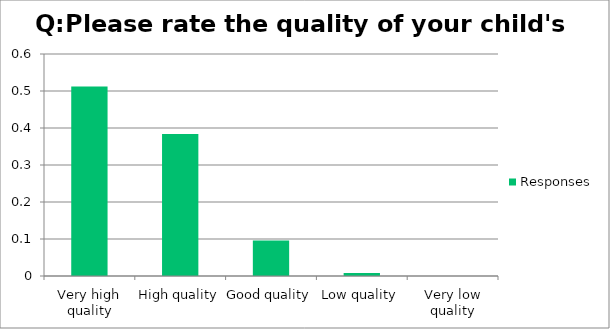
| Category | Responses |
|---|---|
| Very high quality | 0.512 |
| High quality | 0.384 |
| Good quality | 0.096 |
| Low quality | 0.008 |
| Very low quality | 0 |